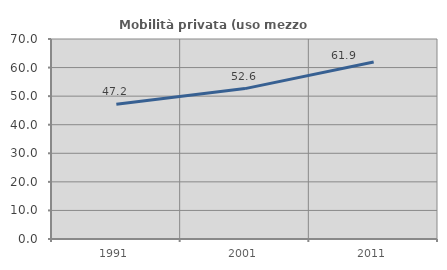
| Category | Mobilità privata (uso mezzo privato) |
|---|---|
| 1991.0 | 47.201 |
| 2001.0 | 52.64 |
| 2011.0 | 61.944 |